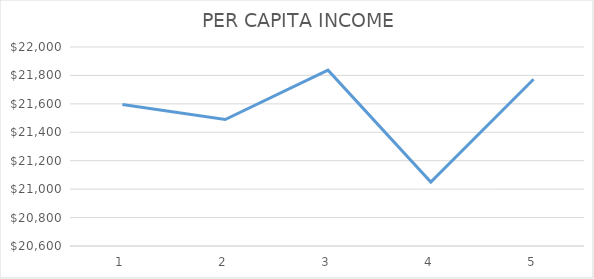
| Category | Series 0 |
|---|---|
| 0 | 21595.797 |
| 1 | 21489.653 |
| 2 | 21836.955 |
| 3 | 21049.392 |
| 4 | 21773.057 |